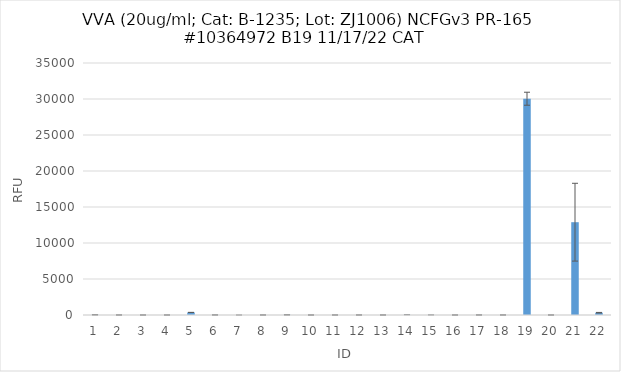
| Category | RFU |
|---|---|
| 0 | 28 |
| 1 | 4.25 |
| 2 | 1.5 |
| 3 | 2 |
| 4 | 357.25 |
| 5 | 9 |
| 6 | 0.5 |
| 7 | 4 |
| 8 | 22.75 |
| 9 | 2 |
| 10 | -1 |
| 11 | 4.25 |
| 12 | 3 |
| 13 | 15.5 |
| 14 | 6.25 |
| 15 | 2.25 |
| 16 | 6.75 |
| 17 | 4.75 |
| 18 | 30037.75 |
| 19 | 2.25 |
| 20 | 12888.75 |
| 21 | 322.25 |